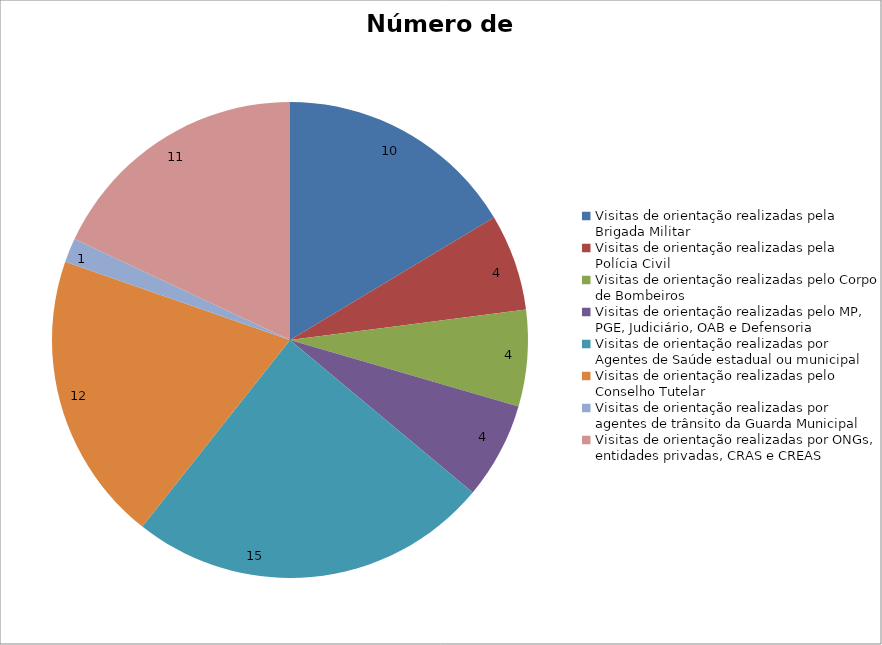
| Category | Número de Ações |
|---|---|
| Visitas de orientação realizadas pela Brigada Militar | 10 |
| Visitas de orientação realizadas pela Polícia Civil | 4 |
| Visitas de orientação realizadas pelo Corpo de Bombeiros | 4 |
| Visitas de orientação realizadas pelo MP, PGE, Judiciário, OAB e Defensoria | 4 |
| Visitas de orientação realizadas por Agentes de Saúde estadual ou municipal | 15 |
| Visitas de orientação realizadas pelo Conselho Tutelar | 12 |
| Visitas de orientação realizadas por agentes de trânsito da Guarda Municipal | 1 |
| Visitas de orientação realizadas por ONGs, entidades privadas, CRAS e CREAS | 11 |